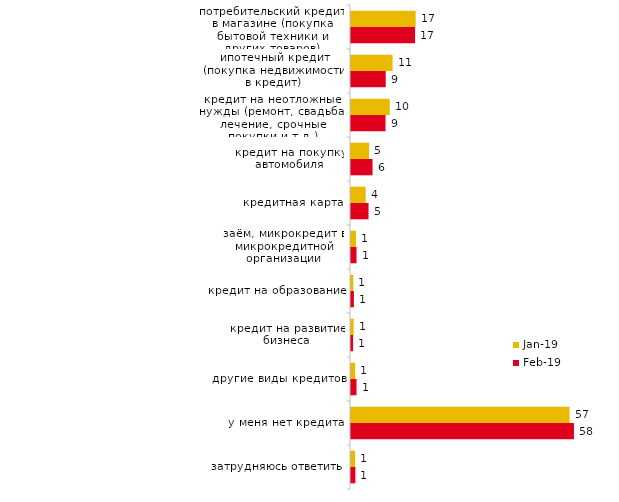
| Category | янв.19 | фев.19 |
|---|---|---|
| потребительский кредит в магазине (покупка бытовой техники и других товаров) | 16.95 | 16.8 |
| ипотечный кредит (покупка недвижимости в кредит) | 10.9 | 9.1 |
| кредит на неотложные нужды (ремонт, свадьба, лечение, срочные покупки и т.д.) | 10.15 | 9.05 |
| кредит на покупку автомобиля | 4.75 | 5.65 |
| кредитная карта | 3.85 | 4.6 |
| заём, микрокредит в микрокредитной организации | 1.3 | 1.45 |
| кредит на образование | 0.6 | 0.75 |
| кредит на развитие бизнеса | 0.7 | 0.55 |
| другие виды кредитов | 1.1 | 1.45 |
| у меня нет кредита | 57.3 | 58.45 |
| затрудняюсь ответить | 1.05 | 1.15 |